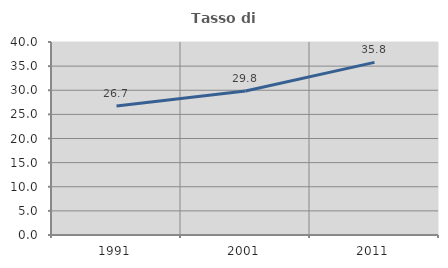
| Category | Tasso di occupazione   |
|---|---|
| 1991.0 | 26.733 |
| 2001.0 | 29.828 |
| 2011.0 | 35.774 |